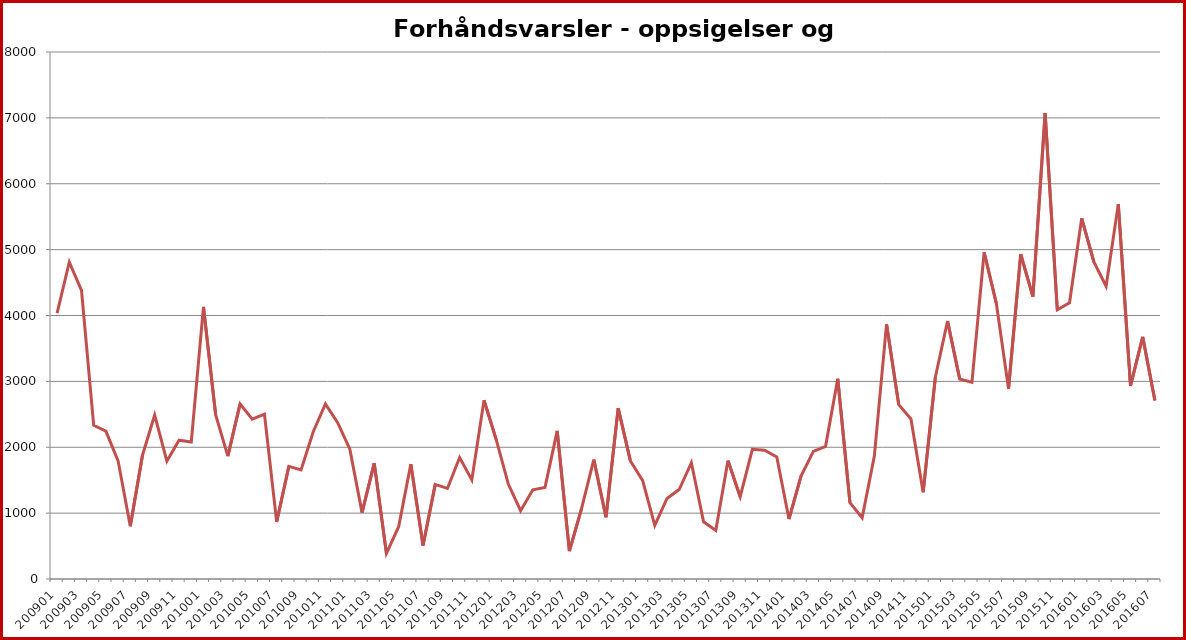
| Category | Series 1 |
|---|---|
| 200901.0 | 4035 |
| 200902.0 | 4810 |
| 200903.0 | 4381 |
| 200904.0 | 2332 |
| 200905.0 | 2245 |
| 200906.0 | 1794 |
| 200907.0 | 802 |
| 200908.0 | 1879 |
| 200909.0 | 2489 |
| 200910.0 | 1789 |
| 200911.0 | 2107 |
| 200912.0 | 2080 |
| 201001.0 | 4130 |
| 201002.0 | 2490 |
| 201003.0 | 1865 |
| 201004.0 | 2658 |
| 201005.0 | 2427 |
| 201006.0 | 2503 |
| 201007.0 | 866 |
| 201008.0 | 1711 |
| 201009.0 | 1655 |
| 201010.0 | 2235 |
| 201011.0 | 2658 |
| 201012.0 | 2374 |
| 201101.0 | 1971 |
| 201102.0 | 1008 |
| 201103.0 | 1759 |
| 201104.0 | 389 |
| 201105.0 | 794 |
| 201106.0 | 1744 |
| 201107.0 | 509 |
| 201108.0 | 1436 |
| 201109.0 | 1374 |
| 201110.0 | 1844 |
| 201111.0 | 1504 |
| 201112.0 | 2714 |
| 201201.0 | 2115 |
| 201202.0 | 1437 |
| 201203.0 | 1037 |
| 201204.0 | 1355 |
| 201205.0 | 1390 |
| 201206.0 | 2249 |
| 201207.0 | 423 |
| 201208.0 | 1073 |
| 201209.0 | 1812 |
| 201210.0 | 937 |
| 201211.0 | 2594 |
| 201212.0 | 1792 |
| 201301.0 | 1496 |
| 201302.0 | 813 |
| 201303.0 | 1223 |
| 201304.0 | 1358 |
| 201305.0 | 1765 |
| 201306.0 | 869 |
| 201307.0 | 738 |
| 201308.0 | 1797 |
| 201309.0 | 1250 |
| 201310.0 | 1969 |
| 201311.0 | 1954 |
| 201312.0 | 1853 |
| 201401.0 | 910 |
| 201402.0 | 1568 |
| 201403.0 | 1937 |
| 201404.0 | 2014 |
| 201405.0 | 3040 |
| 201406.0 | 1160 |
| 201407.0 | 929 |
| 201408.0 | 1866 |
| 201409.0 | 3868 |
| 201410.0 | 2646 |
| 201411.0 | 2429 |
| 201412.0 | 1317 |
| 201501.0 | 3062 |
| 201502.0 | 3915 |
| 201503.0 | 3035 |
| 201504.0 | 2985 |
| 201505.0 | 4960 |
| 201506.0 | 4185 |
| 201507.0 | 2888 |
| 201508.0 | 4930 |
| 201509.0 | 4286 |
| 201510.0 | 7072 |
| 201511.0 | 4087 |
| 201512.0 | 4193 |
| 201601.0 | 5475 |
| 201602.0 | 4812 |
| 201603.0 | 4444 |
| 201604.0 | 5691 |
| 201605.0 | 2931 |
| 201606.0 | 3676 |
| 201607.0 | 2709 |